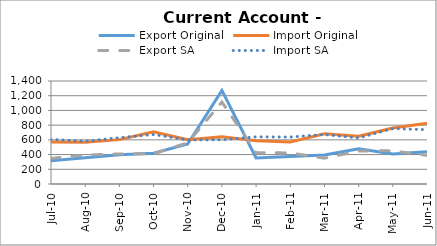
| Category | Export Original | Import Original | Export SA | Import SA |
|---|---|---|---|---|
| 2010-07-31 | 315 | 570 | 348 | 606 |
| 2010-08-31 | 356 | 569 | 394 | 581 |
| 2010-09-30 | 397 | 603 | 408 | 629 |
| 2010-10-31 | 419 | 709 | 412 | 673 |
| 2010-11-30 | 543 | 603 | 561 | 599 |
| 2010-12-31 | 1272 | 643 | 1114 | 601 |
| 2011-01-31 | 353 | 589 | 426 | 641 |
| 2011-02-28 | 373 | 572 | 422 | 638 |
| 2011-03-31 | 393 | 682 | 351 | 673 |
| 2011-04-30 | 478 | 648 | 449 | 626 |
| 2011-05-31 | 408 | 760 | 451 | 754 |
| 2011-06-30 | 438 | 826 | 389 | 738 |